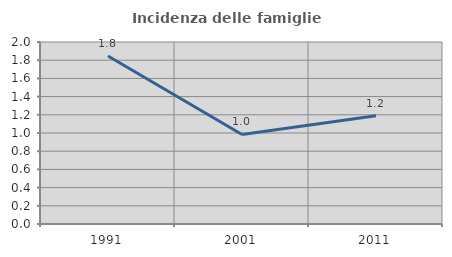
| Category | Incidenza delle famiglie numerose |
|---|---|
| 1991.0 | 1.846 |
| 2001.0 | 0.984 |
| 2011.0 | 1.19 |